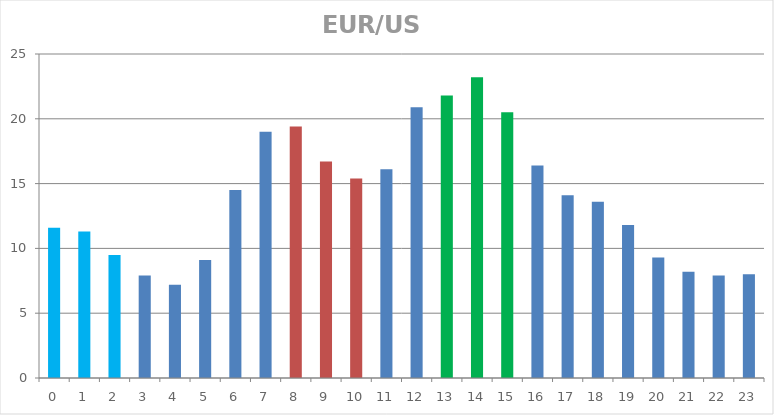
| Category | Series 0 |
|---|---|
| 0 | 11.6 |
| 1 | 11.3 |
| 2 | 9.5 |
| 3 | 7.9 |
| 4 | 7.2 |
| 5 | 9.1 |
| 6 | 14.5 |
| 7 | 19 |
| 8 | 19.4 |
| 9 | 16.7 |
| 10 | 15.4 |
| 11 | 16.1 |
| 12 | 20.9 |
| 13 | 21.8 |
| 14 | 23.2 |
| 15 | 20.5 |
| 16 | 16.4 |
| 17 | 14.1 |
| 18 | 13.6 |
| 19 | 11.8 |
| 20 | 9.3 |
| 21 | 8.2 |
| 22 | 7.9 |
| 23 | 8 |